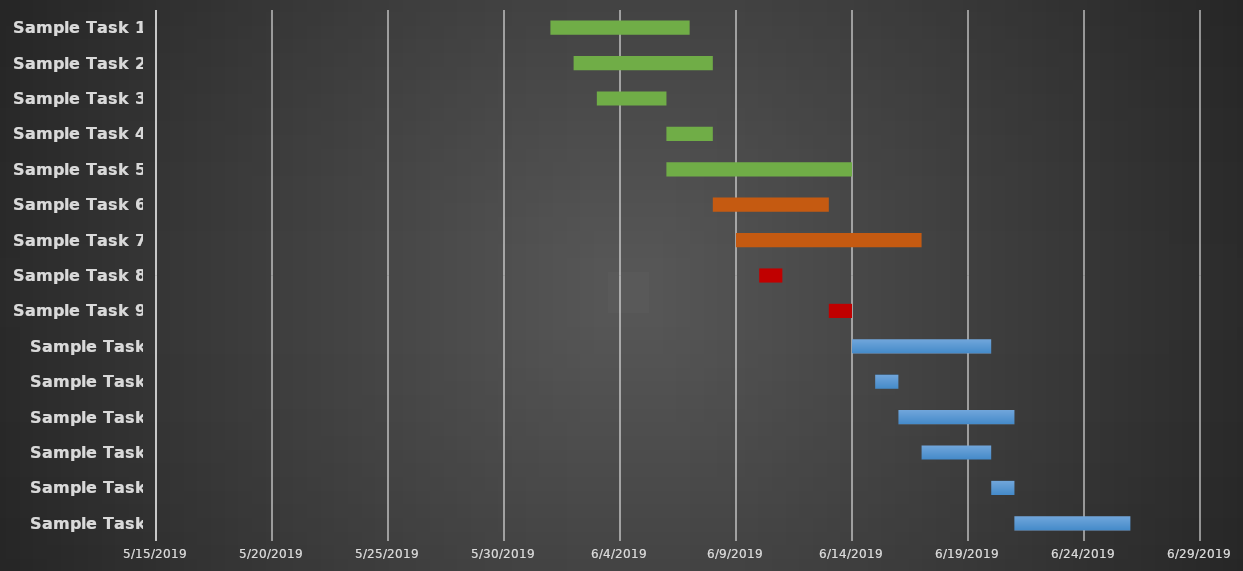
| Category | 6/7/2019 | 6 |
|---|---|---|
| Sample Task 1 | 6/1/19 | 6 |
| Sample Task 2 | 6/2/19 | 6 |
| Sample Task 3 | 6/3/19 | 3 |
| Sample Task 4 | 6/6/19 | 2 |
| Sample Task 5 | 6/6/19 | 8 |
| Sample Task 6 | 6/8/19 | 5 |
| Sample Task 7 | 6/9/19 | 8 |
| Sample Task 8 | 6/10/19 | 1 |
| Sample Task 9 | 6/13/19 | 1 |
| Sample Task 10 | 6/14/19 | 6 |
| Sample Task 11 | 6/15/19 | 1 |
| Sample Task 12 | 6/16/19 | 5 |
| Sample Task 13 | 6/17/19 | 3 |
| Sample Task 14 | 6/20/19 | 1 |
| Sample Task 15 | 6/21/19 | 5 |